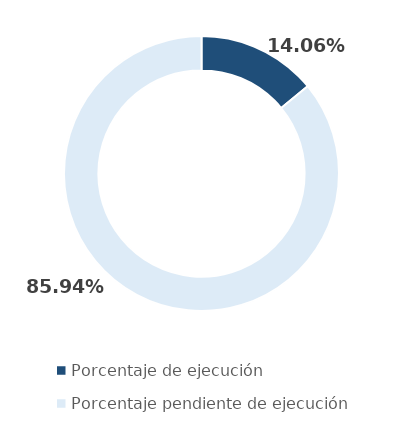
| Category | Series 0 |
|---|---|
| Porcentaje de ejecución | 0.141 |
| Porcentaje pendiente de ejecución | 0.859 |